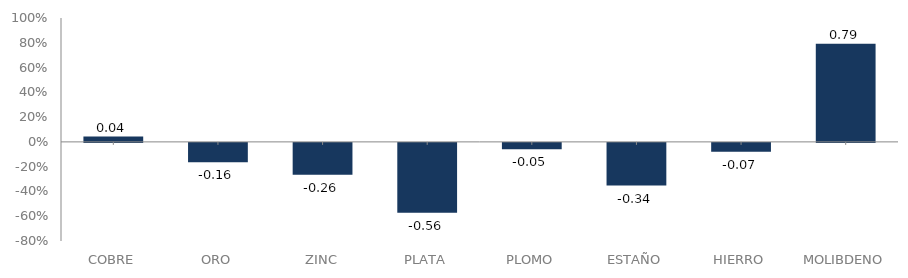
| Category | serie |
|---|---|
| 0 | 0.043 |
| 1 | -0.156 |
| 2 | -0.256 |
| 3 | -0.564 |
| 4 | -0.052 |
| 5 | -0.345 |
| 6 | -0.071 |
| 7 | 0.792 |